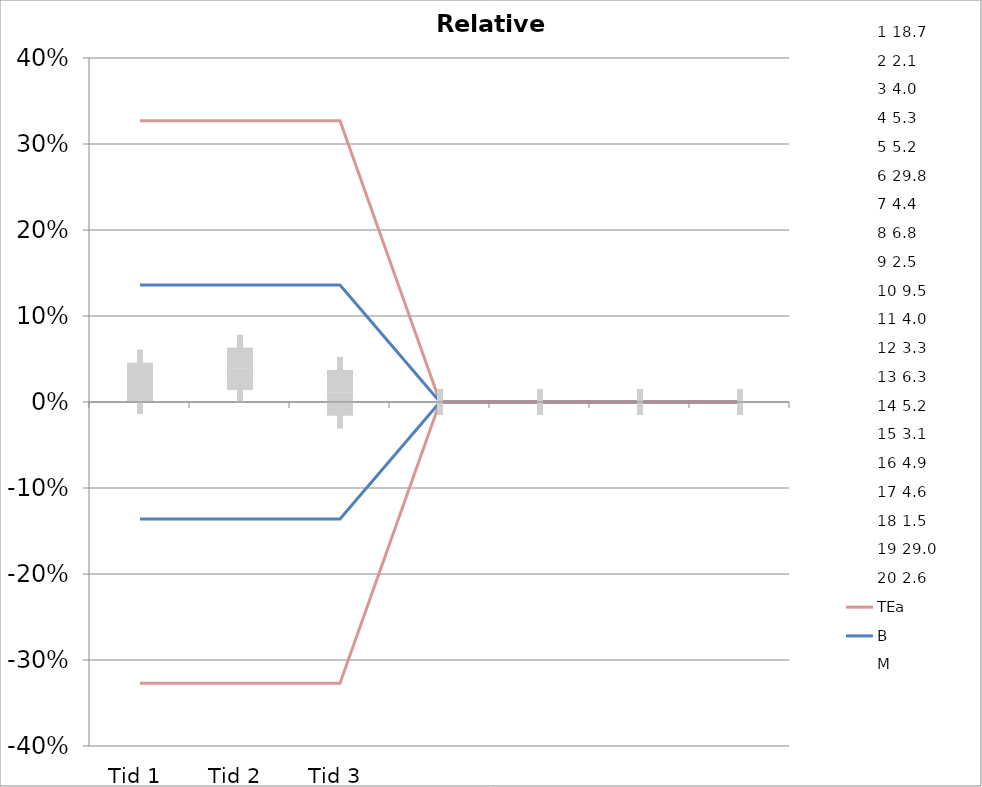
| Category | 1 | 2 | 3 | 4 | 5 | 6 | 7 | 8 | 9 | 10 | 11 | 12 | 13 | 14 | 15 | 16 | 17 | 18 | 19 | 20 | TEa | B | -B | -TEa | M |
|---|---|---|---|---|---|---|---|---|---|---|---|---|---|---|---|---|---|---|---|---|---|---|---|---|---|
| Tid 1 | 0.064 | 0.048 | 0.025 | 0 | 0.058 | 0.003 | -0.045 | 0 | 0.06 | -0.07 | 0.037 | 0.073 | -0.03 | -0.043 | 0.026 | -0.002 | 0.006 | 0.107 | 0.066 | 0.086 | 0.327 | 0.136 | -0.136 | -0.327 | 0.023 |
| Tid 2 | 0.053 | 0.048 | 0.125 | -0.019 | 0.019 | 0.057 | 0.023 | 0 | 0.028 | 0.03 | 0.102 | 0.1 | -0.006 | -0.058 | -0.003 | -0.004 | 0.026 | 0.081 | 0 | 0.132 | 0.327 | 0.136 | -0.136 | -0.327 | 0.039 |
| Tid 3 | 0.032 | 0 | -0.05 | -0.094 | -0.019 | 0.027 | -0.023 | -0.015 | 0.016 | -0.014 | -0.002 | 0.066 | -0.029 | -0.058 | 0.058 | -0.02 | 0.045 | 0.074 | 0.062 | 0.16 | 0.327 | 0.136 | -0.136 | -0.327 | 0.011 |